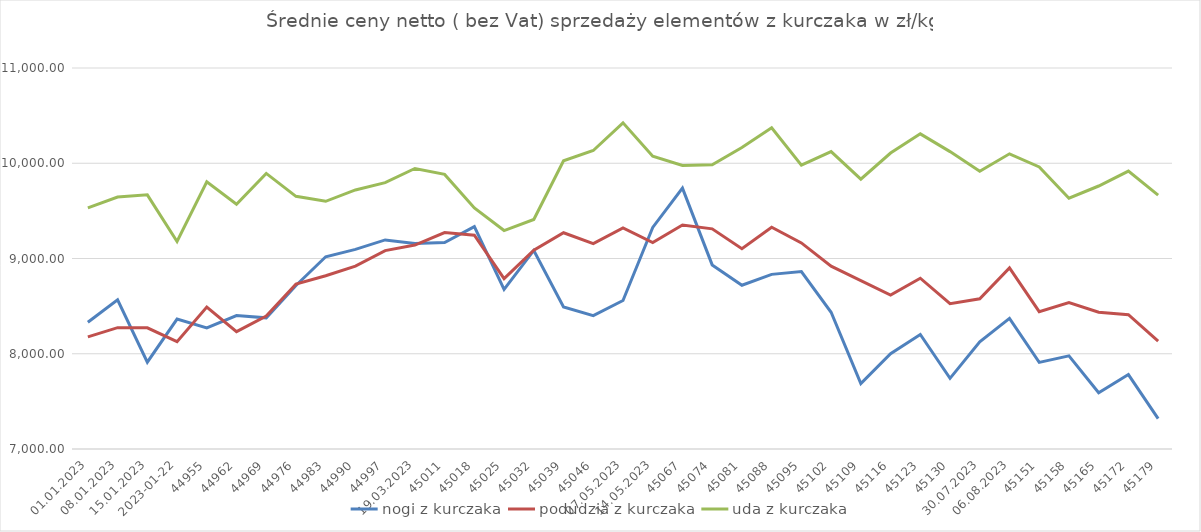
| Category | nogi z kurczaka | podudzia z kurczaka | uda z kurczaka |
|---|---|---|---|
| 01.01.2023 | 8330.748 | 8177.311 | 9532.21 |
| 08.01.2023 | 8566.208 | 8273.877 | 9645.456 |
| 15.01.2023 | 7911.295 | 8272.432 | 9668.176 |
| 2023-01-22 | 8364.275 | 8127.19 | 9178.887 |
| 29.01.2023 | 8271.381 | 8489.386 | 9804.345 |
| 05.02.2023 | 8400.751 | 8231.536 | 9568.988 |
| 12.02.2023 | 8376.902 | 8395.089 | 9893.315 |
| 19.02.2023 | 8717.05 | 8732.576 | 9652.715 |
| 26.02.2023 | 9018.115 | 8819.24 | 9600.302 |
| 05.03.2023 | 9096.166 | 8919.653 | 9719.761 |
| 12.03.2023 | 9195.055 | 9083.262 | 9796.888 |
| 19.03.2023 | 9158.27 | 9141.515 | 9945.208 |
| 26.03.2023 | 9168.181 | 9271.678 | 9883.109 |
| 02.04.2023 | 9334.999 | 9245.142 | 9531.396 |
| 09.04.2023 | 8674.569 | 8788.3 | 9293.355 |
| 16.04.2023 | 9084.356 | 9086.27 | 9409.189 |
| 23.04.2023 | 8491.649 | 9270.47 | 10026.51 |
| 30.04.2023 | 8400 | 9156.979 | 10133.977 |
| 07.05.2023 | 8558.693 | 9320.224 | 10424.142 |
| 14.05.2023 | 9326.106 | 9166.821 | 10073.955 |
| 21.05.2023 | 9739.071 | 9351.025 | 9975.934 |
| 28.05.2023 | 8932.746 | 9311.245 | 9984.24 |
| 04.06.2023 | 8719.269 | 9103.127 | 10164.702 |
| 11.06.2023 | 8833.419 | 9328.091 | 10371.927 |
| 18.06.2023 | 8862.667 | 9163.397 | 9979.444 |
| 25.06.2023 | 8435.716 | 8919.639 | 10121.804 |
| 02.07.2023 | 7687.764 | 8767.874 | 9832.741 |
| 09.07.2023 | 8000.765 | 8615.363 | 10107.134 |
| 16.07.2023 | 8202.484 | 8792.948 | 10308.766 |
| 23.07.2023 | 7741.784 | 8525.54 | 10122.365 |
| 30.07.2023 | 8124.135 | 8577.572 | 9916.046 |
| 06.08.2023 | 8371.089 | 8901.483 | 10099.026 |
| 13.08.2023 | 7908.93 | 8441.88 | 9960.938 |
| 20.08.2023 | 7977.673 | 8538.488 | 9633.407 |
| 27.08.2023 | 7591.035 | 8436.577 | 9761.022 |
| 03.09.2023 | 7781.4 | 8409.834 | 9918.171 |
| 10.09.2023 | 7319.093 | 8131.345 | 9664.676 |